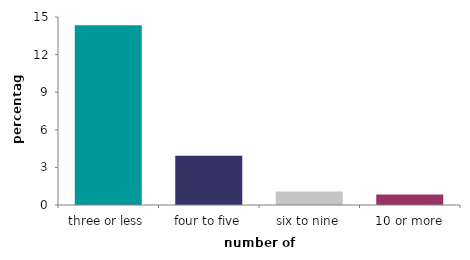
| Category | Series 0 |
|---|---|
| three or less | 14.343 |
| four to five | 3.932 |
| six to nine | 1.082 |
| 10 or more | 0.835 |